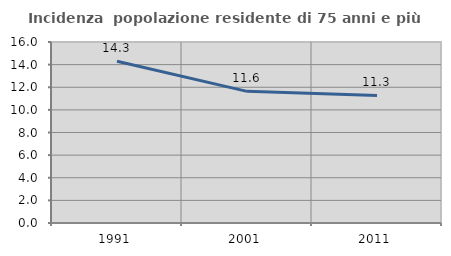
| Category | Incidenza  popolazione residente di 75 anni e più |
|---|---|
| 1991.0 | 14.304 |
| 2001.0 | 11.636 |
| 2011.0 | 11.274 |